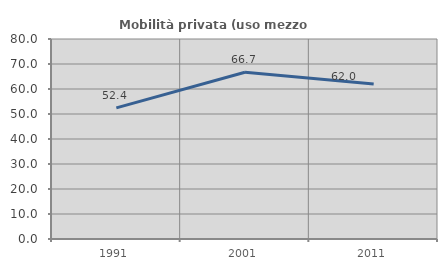
| Category | Mobilità privata (uso mezzo privato) |
|---|---|
| 1991.0 | 52.435 |
| 2001.0 | 66.672 |
| 2011.0 | 62.015 |